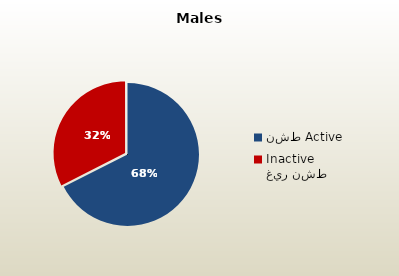
| Category | الذكور القطريين  Qatari Males |
|---|---|
| نشط Active | 67668 |
| غير نشط Inactive | 32548 |